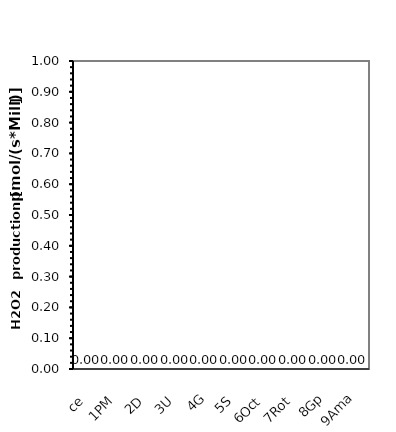
| Category | Amount per chamber (Mill cells/chamber) |
|---|---|
| ce | 0 |
| 1PM | 0 |
| 2D | 0 |
| 3U | 0 |
| 4G | 0 |
| 5S | 0 |
| 6Oct | 0 |
| 7Rot | 0 |
| 8Gp | 0 |
| 9Ama | 0 |